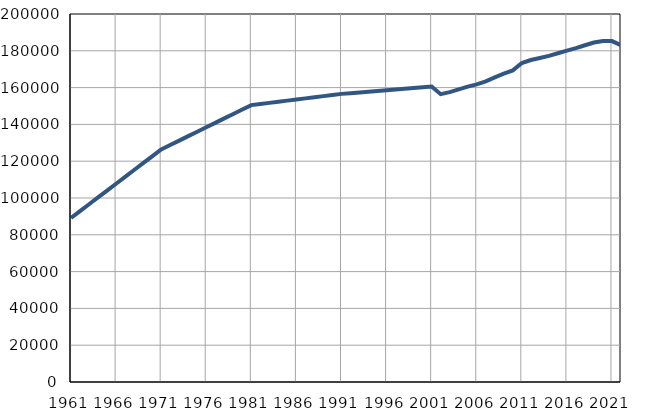
| Category | Population
size |
|---|---|
| 1961.0 | 89141 |
| 1962.0 | 92865 |
| 1963.0 | 96589 |
| 1964.0 | 100313 |
| 1965.0 | 104037 |
| 1966.0 | 107760 |
| 1967.0 | 111484 |
| 1968.0 | 115208 |
| 1969.0 | 118932 |
| 1970.0 | 122656 |
| 1971.0 | 126380 |
| 1972.0 | 128790 |
| 1973.0 | 131201 |
| 1974.0 | 133611 |
| 1975.0 | 136022 |
| 1976.0 | 138432 |
| 1977.0 | 140842 |
| 1978.0 | 143253 |
| 1979.0 | 145663 |
| 1980.0 | 148074 |
| 1981.0 | 150484 |
| 1982.0 | 151094 |
| 1983.0 | 151705 |
| 1984.0 | 152315 |
| 1985.0 | 152925 |
| 1986.0 | 153535 |
| 1987.0 | 154146 |
| 1988.0 | 154756 |
| 1989.0 | 155366 |
| 1990.0 | 155977 |
| 1991.0 | 156587 |
| 1992.0 | 156988 |
| 1993.0 | 157389 |
| 1994.0 | 157791 |
| 1995.0 | 158191 |
| 1996.0 | 158592 |
| 1997.0 | 158994 |
| 1998.0 | 159395 |
| 1999.0 | 159796 |
| 2000.0 | 160197 |
| 2001.0 | 160598 |
| 2002.0 | 156438 |
| 2003.0 | 157528 |
| 2004.0 | 159047 |
| 2005.0 | 160542 |
| 2006.0 | 161753 |
| 2007.0 | 163382 |
| 2008.0 | 165539 |
| 2009.0 | 167559 |
| 2010.0 | 169355 |
| 2011.0 | 173347 |
| 2012.0 | 174973 |
| 2013.0 | 176113 |
| 2014.0 | 177258 |
| 2015.0 | 178670 |
| 2016.0 | 180081 |
| 2017.0 | 181414 |
| 2018.0 | 183003 |
| 2019.0 | 184488 |
| 2020.0 | 185262 |
| 2021.0 | 185270 |
| 2022.0 | 183002 |